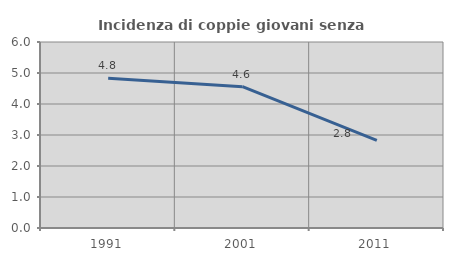
| Category | Incidenza di coppie giovani senza figli |
|---|---|
| 1991.0 | 4.83 |
| 2001.0 | 4.559 |
| 2011.0 | 2.824 |